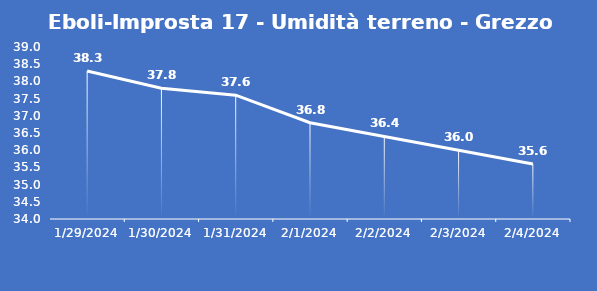
| Category | Eboli-Improsta 17 - Umidità terreno - Grezzo (%VWC) |
|---|---|
| 1/29/24 | 38.3 |
| 1/30/24 | 37.8 |
| 1/31/24 | 37.6 |
| 2/1/24 | 36.8 |
| 2/2/24 | 36.4 |
| 2/3/24 | 36 |
| 2/4/24 | 35.6 |